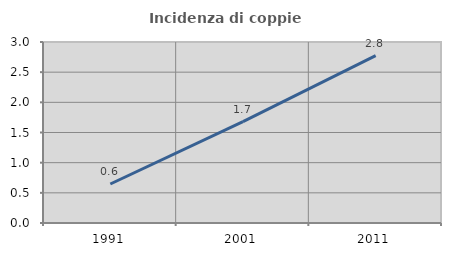
| Category | Incidenza di coppie miste |
|---|---|
| 1991.0 | 0.646 |
| 2001.0 | 1.679 |
| 2011.0 | 2.775 |